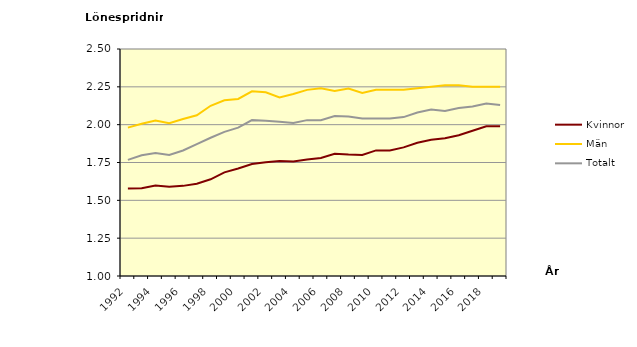
| Category | Kvinnor | Män | Totalt |
|---|---|---|---|
| 1992.0 | 1.578 | 1.98 | 1.768 |
| 1993.0 | 1.58 | 2.006 | 1.798 |
| 1994.0 | 1.598 | 2.027 | 1.812 |
| 1995.0 | 1.59 | 2.01 | 1.8 |
| 1996.0 | 1.596 | 2.037 | 1.83 |
| 1997.0 | 1.61 | 2.062 | 1.871 |
| 1998.0 | 1.639 | 2.125 | 1.914 |
| 1999.0 | 1.685 | 2.161 | 1.953 |
| 2000.0 | 1.71 | 2.17 | 1.98 |
| 2001.0 | 1.74 | 2.22 | 2.03 |
| 2002.0 | 1.752 | 2.214 | 2.026 |
| 2003.0 | 1.76 | 2.18 | 2.02 |
| 2004.0 | 1.756 | 2.203 | 2.011 |
| 2005.0 | 1.77 | 2.23 | 2.03 |
| 2006.0 | 1.78 | 2.24 | 2.03 |
| 2007.0 | 1.808 | 2.223 | 2.057 |
| 2008.0 | 1.802 | 2.238 | 2.054 |
| 2009.0 | 1.8 | 2.21 | 2.04 |
| 2010.0 | 1.83 | 2.23 | 2.04 |
| 2011.0 | 1.83 | 2.23 | 2.04 |
| 2012.0 | 1.85 | 2.23 | 2.05 |
| 2013.0 | 1.88 | 2.24 | 2.08 |
| 2014.0 | 1.9 | 2.25 | 2.1 |
| 2015.0 | 1.91 | 2.26 | 2.09 |
| 2016.0 | 1.93 | 2.26 | 2.11 |
| 2017.0 | 1.96 | 2.25 | 2.12 |
| 2018.0 | 1.99 | 2.25 | 2.14 |
| 2019.0 | 1.99 | 2.25 | 2.13 |